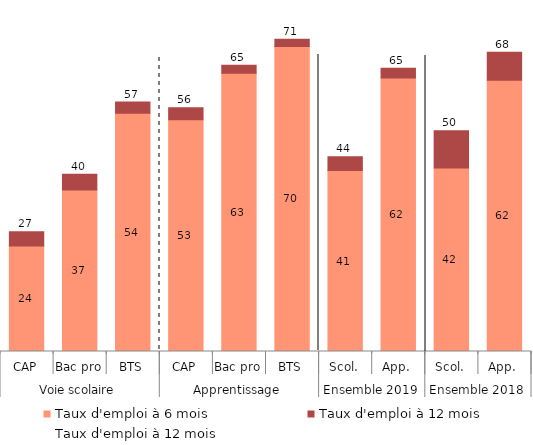
| Category | Taux d'emploi à 6 mois | Taux d'emploi à 12 mois |
|---|---|---|
| 0 | 24.06 | 3.26 |
| 1 | 36.83 | 3.59 |
| 2 | 54.31 | 2.53 |
| 3 | 52.83 | 2.75 |
| 4 | 63.41 | 1.81 |
| 5 | 69.53 | 1.61 |
| 6 | 41.23 | 3.15 |
| 7 | 62.33 | 2.2 |
| 8 | 41.8 | 8.53 |
| 9 | 61.85 | 6.36 |